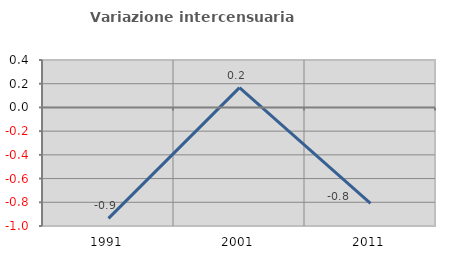
| Category | Variazione intercensuaria annua |
|---|---|
| 1991.0 | -0.936 |
| 2001.0 | 0.167 |
| 2011.0 | -0.809 |